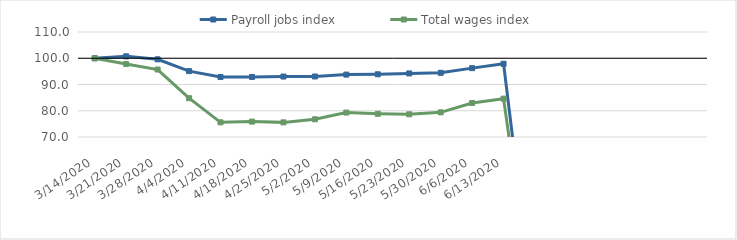
| Category | Payroll jobs index | Total wages index |
|---|---|---|
| 14/03/2020 | 100 | 100 |
| 21/03/2020 | 100.732 | 97.781 |
| 28/03/2020 | 99.596 | 95.703 |
| 04/04/2020 | 95.098 | 84.79 |
| 11/04/2020 | 92.841 | 75.594 |
| 18/04/2020 | 92.879 | 75.867 |
| 25/04/2020 | 93.034 | 75.572 |
| 02/05/2020 | 93.058 | 76.748 |
| 09/05/2020 | 93.763 | 79.309 |
| 16/05/2020 | 93.888 | 78.856 |
| 23/05/2020 | 94.216 | 78.654 |
| 30/05/2020 | 94.447 | 79.392 |
| 06/06/2020 | 96.237 | 82.965 |
| 13/06/2020 | 97.898 | 84.612 |